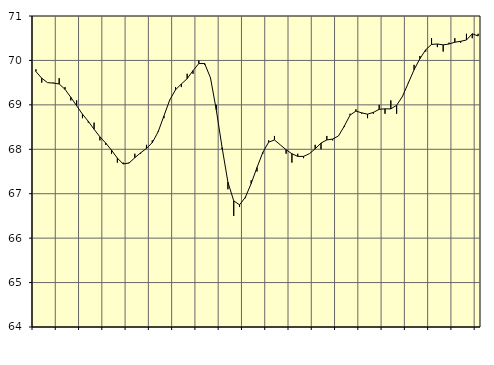
| Category | Piggar | Series 1 |
|---|---|---|
| nan | 69.8 | 69.75 |
| 1.0 | 69.5 | 69.6 |
| 1.0 | 69.5 | 69.5 |
| 1.0 | 69.5 | 69.49 |
| nan | 69.6 | 69.47 |
| 2.0 | 69.4 | 69.35 |
| 2.0 | 69.1 | 69.17 |
| 2.0 | 69.1 | 68.98 |
| nan | 68.7 | 68.79 |
| 3.0 | 68.6 | 68.63 |
| 3.0 | 68.6 | 68.45 |
| 3.0 | 68.2 | 68.28 |
| nan | 68.1 | 68.14 |
| 4.0 | 67.9 | 67.98 |
| 4.0 | 67.7 | 67.8 |
| 4.0 | 67.7 | 67.67 |
| nan | 67.7 | 67.69 |
| 5.0 | 67.9 | 67.81 |
| 5.0 | 67.9 | 67.92 |
| 5.0 | 68.1 | 68.02 |
| nan | 68.2 | 68.15 |
| 6.0 | 68.4 | 68.39 |
| 6.0 | 68.7 | 68.75 |
| 6.0 | 69.1 | 69.11 |
| nan | 69.4 | 69.34 |
| 7.0 | 69.4 | 69.47 |
| 7.0 | 69.7 | 69.59 |
| 7.0 | 69.7 | 69.77 |
| nan | 70 | 69.93 |
| 8.0 | 69.9 | 69.93 |
| 8.0 | 69.6 | 69.61 |
| 8.0 | 69 | 68.89 |
| nan | 68 | 68.04 |
| 9.0 | 67.1 | 67.26 |
| 9.0 | 66.5 | 66.84 |
| 9.0 | 66.7 | 66.75 |
| nan | 66.9 | 66.92 |
| 10.0 | 67.3 | 67.23 |
| 10.0 | 67.5 | 67.59 |
| 10.0 | 67.9 | 67.93 |
| nan | 68.2 | 68.16 |
| 11.0 | 68.3 | 68.21 |
| 11.0 | 68.1 | 68.1 |
| 11.0 | 67.9 | 67.99 |
| nan | 67.7 | 67.9 |
| 12.0 | 67.9 | 67.84 |
| 12.0 | 67.8 | 67.84 |
| 12.0 | 67.9 | 67.9 |
| nan | 68.1 | 68.01 |
| 13.0 | 68 | 68.14 |
| 13.0 | 68.3 | 68.21 |
| 13.0 | 68.2 | 68.23 |
| nan | 68.3 | 68.3 |
| 14.0 | 68.5 | 68.52 |
| 14.0 | 68.8 | 68.77 |
| 14.0 | 68.9 | 68.86 |
| nan | 68.8 | 68.82 |
| 15.0 | 68.7 | 68.79 |
| 15.0 | 68.8 | 68.83 |
| 15.0 | 69 | 68.9 |
| nan | 68.8 | 68.91 |
| 16.0 | 69.1 | 68.91 |
| 16.0 | 68.8 | 68.99 |
| 16.0 | 69.2 | 69.19 |
| nan | 69.5 | 69.49 |
| 17.0 | 69.9 | 69.79 |
| 17.0 | 70.1 | 70.04 |
| 17.0 | 70.2 | 70.24 |
| nan | 70.5 | 70.36 |
| 18.0 | 70.3 | 70.37 |
| 18.0 | 70.2 | 70.35 |
| 18.0 | 70.4 | 70.37 |
| nan | 70.5 | 70.41 |
| 19.0 | 70.4 | 70.43 |
| 19.0 | 70.6 | 70.46 |
| 19.0 | 70.5 | 70.6 |
| nan | 70.6 | 70.55 |